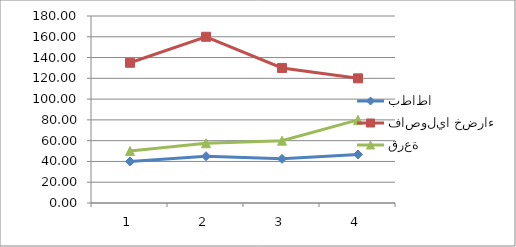
| Category | بطاطا | فاصوليا خضراء | قرعة |
|---|---|---|---|
| 0 | 40 | 135 | 50 |
| 1 | 45 | 160 | 57.5 |
| 2 | 42.5 | 130 | 60 |
| 3 | 46.667 | 120 | 80 |